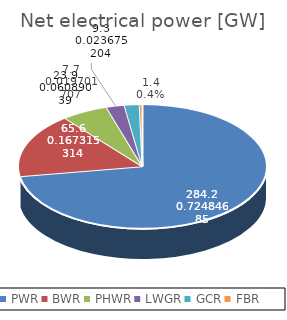
| Category | Net electrical power [GW] |
|---|---|
| PWR | 284.211 |
| BWR | 65.604 |
| PHWR | 23.875 |
| LWGR | 9.283 |
| GCR | 7.725 |
| FBR | 1.4 |